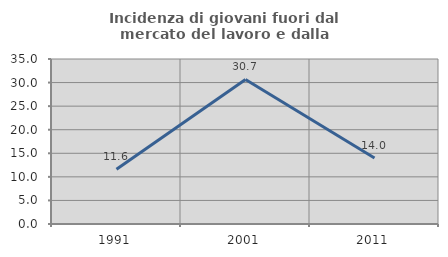
| Category | Incidenza di giovani fuori dal mercato del lavoro e dalla formazione  |
|---|---|
| 1991.0 | 11.628 |
| 2001.0 | 30.671 |
| 2011.0 | 13.983 |